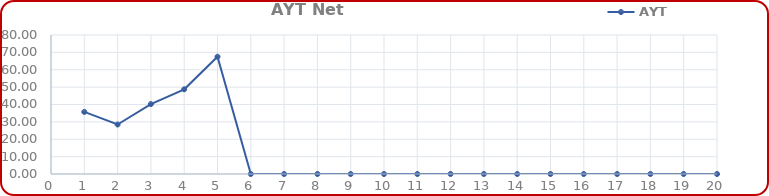
| Category | AYT |
|---|---|
| 0 | 35.75 |
| 1 | 28.5 |
| 2 | 40.25 |
| 3 | 48.75 |
| 4 | 67.5 |
| 5 | 0 |
| 6 | 0 |
| 7 | 0 |
| 8 | 0 |
| 9 | 0 |
| 10 | 0 |
| 11 | 0 |
| 12 | 0 |
| 13 | 0 |
| 14 | 0 |
| 15 | 0 |
| 16 | 0 |
| 17 | 0 |
| 18 | 0 |
| 19 | 0 |